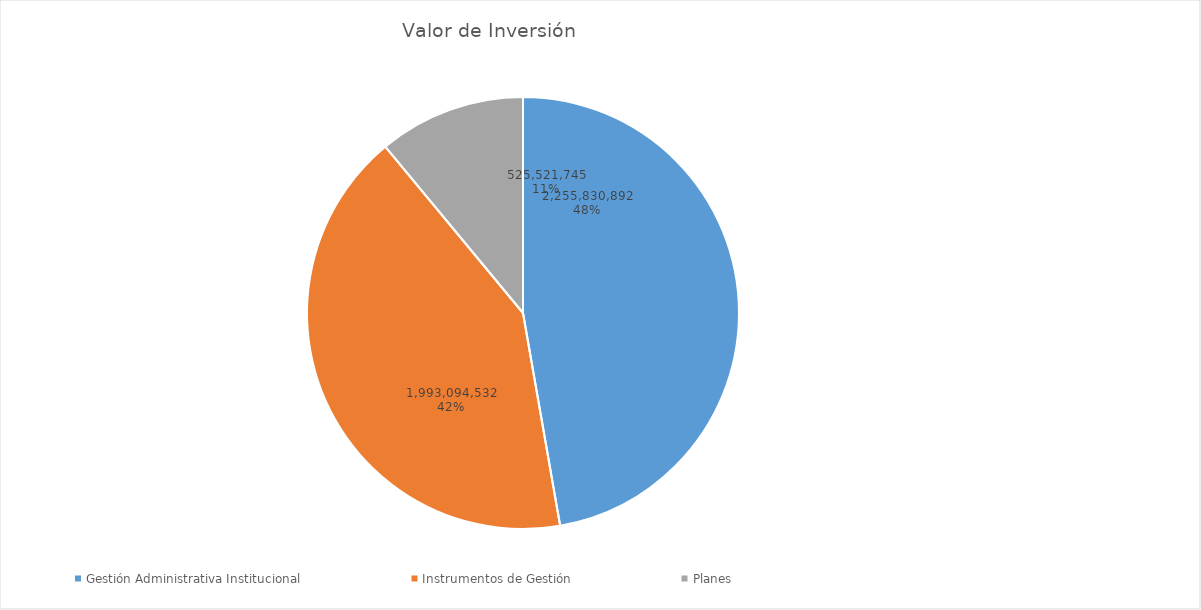
| Category | Valor de Inversión | Porcentaje de Ejecución dentro de la Actividad |
|---|---|---|
| Gestión Administrativa Institucional | 2255830892 | 7 |
| Instrumentos de Gestión | 1993094532 | 7 |
| Planes | 525521745 | 4 |